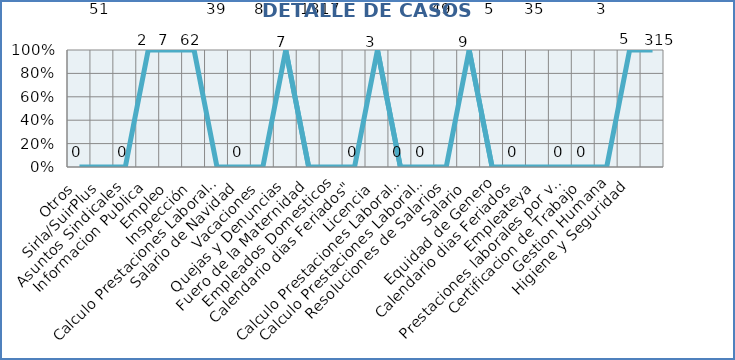
| Category | Series 0 |
|---|---|
| Otros | 0 |
| Sirla/SuirPlus | 0 |
| Asuntos Sindicales | 0 |
| Informacion Publica | 2 |
| Empleo | 4 |
| Inspección | 74 |
| Calculo Prestaciones Laborales | 0 |
| Salario de Navidad | 0 |
| Vacaciones | 0 |
| Quejas y Denuncias | 7 |
| Fuero de la Maternidad | 0 |
| Empleados Domesticos | 0 |
| Calendario dias Feriados" | 0 |
| Licencia | 1 |
| Calculo Prestaciones Laborales por quiebra empresa | 0 |
| Calculo Prestaciones Laborales por renuncia | 0 |
| Resoluciones de Salarios | 0 |
| Salario | 50 |
| Equidad de Genero | 0 |
| Calendario dias Feriados | 0 |
| Empleateya | 0 |
| Prestaciones laborales por venta empresa | 0 |
| Certificacion de Trabajo | 0 |
| Gestion Humana | 0 |
| Higiene y Seguridad | 5 |